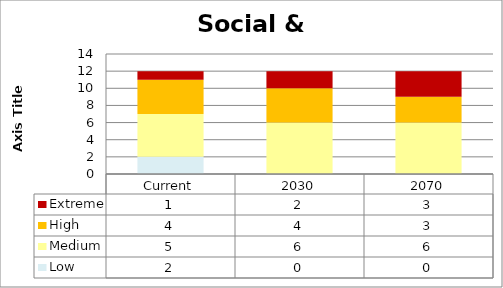
| Category | Low | Medium | High | Extreme |
|---|---|---|---|---|
| Current | 2 | 5 | 4 | 1 |
| 2030 | 0 | 6 | 4 | 2 |
| 2070 | 0 | 6 | 3 | 3 |